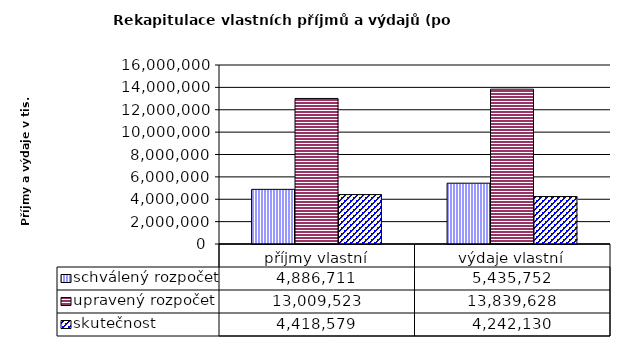
| Category | schválený rozpočet | upravený rozpočet | skutečnost |
|---|---|---|---|
| příjmy vlastní | 4886711 | 13009523 | 4418579 |
| výdaje vlastní | 5435752 | 13839628 | 4242130 |